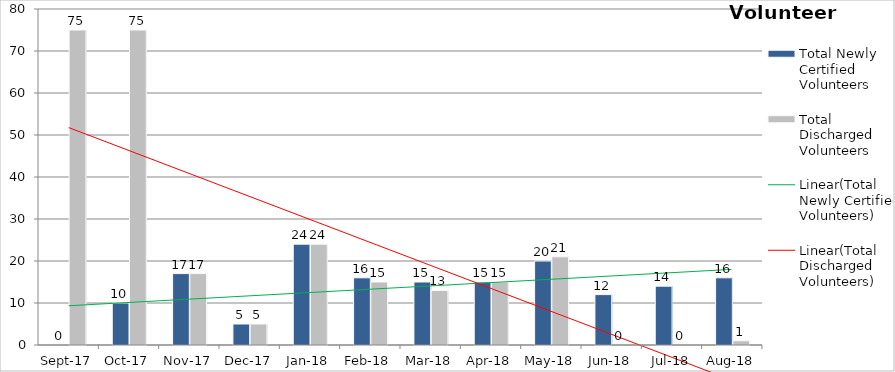
| Category | Total Newly Certified Volunteers | Total Discharged Volunteers |
|---|---|---|
| 2017-09-01 | 0 | 75 |
| 2017-10-01 | 10 | 75 |
| 2017-11-01 | 17 | 17 |
| 2017-12-01 | 5 | 5 |
| 2018-01-01 | 24 | 24 |
| 2018-02-01 | 16 | 15 |
| 2018-03-01 | 15 | 13 |
| 2018-04-01 | 15 | 15 |
| 2018-05-01 | 20 | 21 |
| 2018-06-01 | 12 | 0 |
| 2018-07-01 | 14 | 0 |
| 2018-08-01 | 16 | 1 |